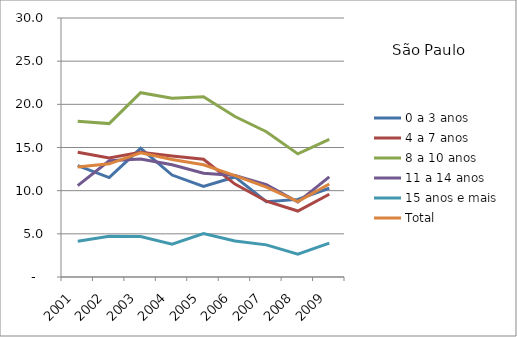
| Category | 0 a 3 anos | 4 a 7 anos | 8 a 10 anos | 11 a 14 anos | 15 anos e mais | Total |
|---|---|---|---|---|---|---|
| 2001.0 | 12.9 | 14.45 | 18.04 | 10.58 | 4.15 | 12.75 |
| 2002.0 | 11.52 | 13.79 | 17.77 | 13.46 | 4.71 | 13.11 |
| 2003.0 | 14.9 | 14.45 | 21.35 | 13.66 | 4.7 | 14.38 |
| 2004.0 | 11.81 | 14.02 | 20.71 | 13 | 3.81 | 13.62 |
| 2005.0 | 10.5 | 13.64 | 20.87 | 12.03 | 5.03 | 13 |
| 2006.0 | 11.59 | 10.76 | 18.59 | 11.77 | 4.17 | 11.75 |
| 2007.0 | 8.73 | 8.78 | 16.83 | 10.71 | 3.72 | 10.41 |
| 2008.0 | 8.99 | 7.64 | 14.26 | 8.68 | 2.65 | 8.73 |
| 2009.0 | 10.28 | 9.58 | 15.94 | 11.59 | 3.92 | 10.77 |